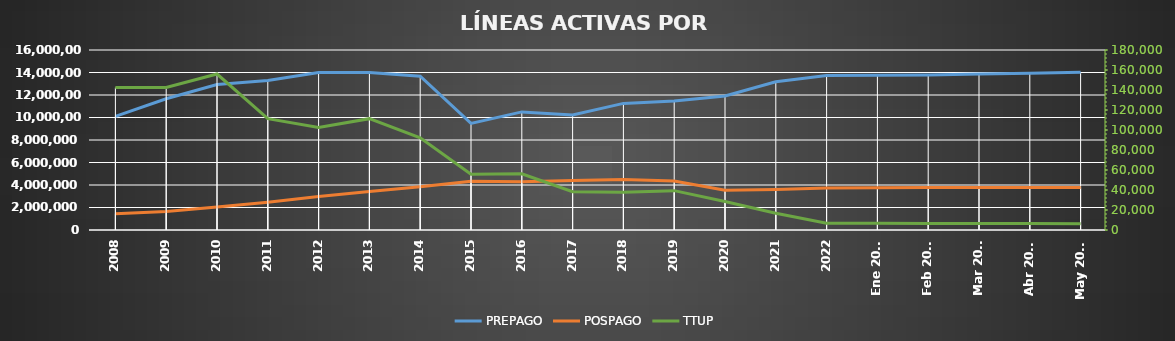
| Category | PREPAGO | POSPAGO |
|---|---|---|
| 2008 | 10097768 | 1452088 |
| 2009 | 11662294 | 1649838 |
| 2010 | 12929040 | 2033814 |
| 2011 | 13295834 | 2467378 |
| 2012 | 14008104 | 2976194 |
| 2013 | 14005126 | 3425277 |
| 2014 | 13666071 | 3846271 |
| 2015 | 9476240 | 4326937 |
| 2016 | 10498467 | 4293426 |
| 2017 | 10219457 | 4393703 |
| 2018 | 11254168 | 4480975 |
| 2019 | 11462048 | 4351686 |
| 2020 | 11917697 | 3539192 |
| 2021 | 13174530 | 3598383 |
| 2022 | 13740159 | 3743849 |
| Ene 2023 | 13744592 | 3762200 |
| Feb 2023 | 13771967 | 3773530 |
| Mar 2023 | 13859395 | 3786936 |
| Abr 2023 | 13944065 | 3768457 |
| May 2023 | 14014722 | 3780848 |